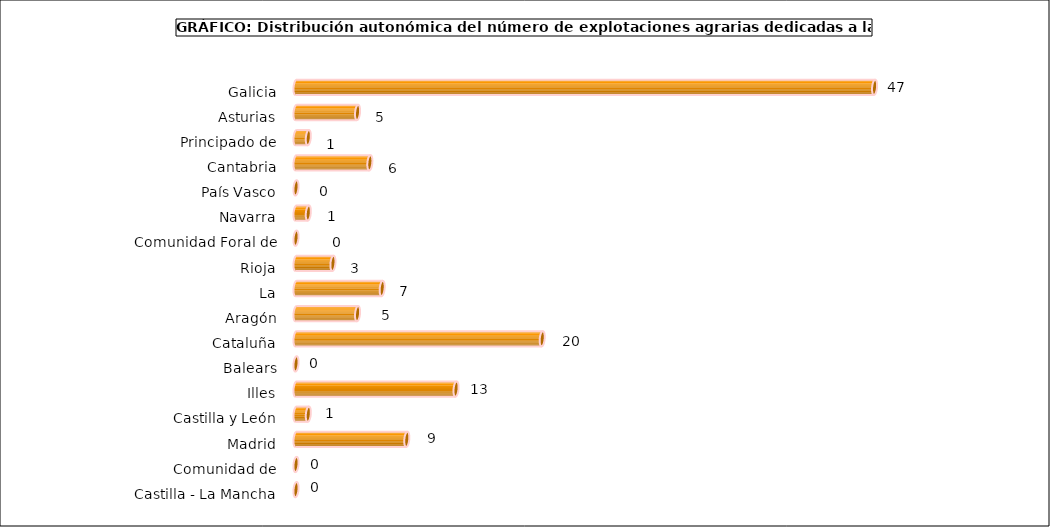
| Category | num. Explotaciones |
|---|---|
| 0 | 47 |
| 1 | 5 |
| 2 | 1 |
| 3 | 6 |
| 4 | 0 |
| 5 | 1 |
| 6 | 0 |
| 7 | 3 |
| 8 | 7 |
| 9 | 5 |
| 10 | 20 |
| 11 | 0 |
| 12 | 13 |
| 13 | 1 |
| 14 | 9 |
| 15 | 0 |
| 16 | 0 |